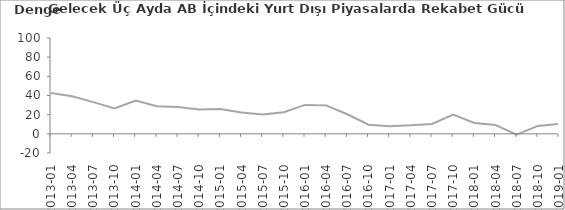
| Category | Gelecek Üç Aydaki AB İçindeki Piyasalarda Rekabet Gücü Beklentisi |
|---|---|
| 2013-01 | 42.7 |
| 2013-04 | 39.2 |
| 2013-07 | 33.1 |
| 2013-10 | 26.6 |
| 2014-01 | 34.7 |
| 2014-04 | 28.7 |
| 2014-07 | 28.1 |
| 2014-10 | 25.4 |
| 2015-01 | 25.8 |
| 2015-04 | 22.3 |
| 2015-07 | 20.3 |
| 2015-10 | 22.5 |
| 2016-01 | 30.2 |
| 2016-04 | 29.7 |
| 2016-07 | 20.4 |
| 2016-10 | 9.5 |
| 2017-01 | 8 |
| 2017-04 | 8.9 |
| 2017-07 | 10.3 |
| 2017-10 | 20.1 |
| 2018-01 | 11.3 |
| 2018-04 | 9.2 |
| 2018-07 | -0.9 |
| 2018-10 | 8.3 |
| 2019-01 | 10.3 |